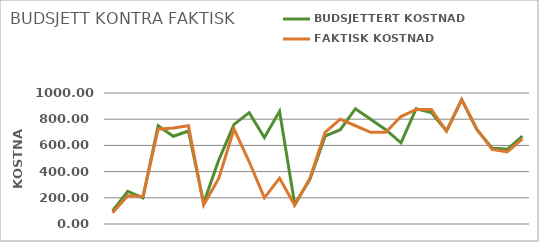
| Category | BUDSJETTERT KOSTNAD | FAKTISK KOSTNAD |
|---|---|---|
| 0 | 100 | 85 |
| 1 | 250 | 215 |
| 2 | 200 | 210 |
| 3 | 750 | 724 |
| 4 | 670 | 733 |
| 5 | 710 | 750 |
| 6 | 160 | 145 |
| 7 | 490 | 350 |
| 8 | 760 | 725 |
| 9 | 850 | 475 |
| 10 | 660 | 200 |
| 11 | 860 | 350 |
| 12 | 150 | 144 |
| 13 | 340 | 350 |
| 14 | 670 | 700 |
| 15 | 720 | 800 |
| 16 | 880 | 750 |
| 17 | 800 | 700 |
| 18 | 720 | 700 |
| 19 | 620 | 820 |
| 20 | 880 | 875 |
| 21 | 850 | 875 |
| 22 | 710 | 710 |
| 23 | 950 | 949 |
| 24 | 720 | 725 |
| 25 | 580 | 569 |
| 26 | 570 | 550 |
| 27 | 670 | 650 |